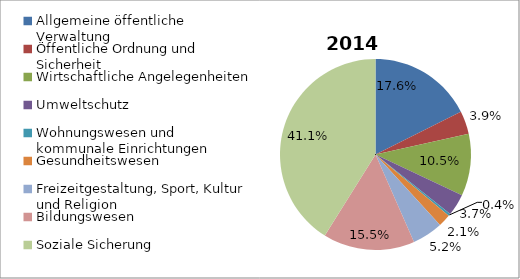
| Category | 2014 |
|---|---|
| Allgemeine öffentliche Verwaltung | 0.176 |
| Öffentliche Ordnung und Sicherheit | 0.039 |
| Wirtschaftliche Angelegenheiten | 0.105 |
| Umweltschutz | 0.037 |
| Wohnungswesen und kommunale Einrichtungen | 0.004 |
| Gesundheitswesen | 0.021 |
| Freizeitgestaltung, Sport, Kultur und Religion | 0.052 |
| Bildungswesen | 0.155 |
| Soziale Sicherung | 0.411 |